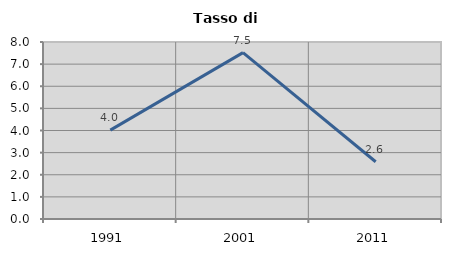
| Category | Tasso di disoccupazione   |
|---|---|
| 1991.0 | 4.016 |
| 2001.0 | 7.519 |
| 2011.0 | 2.586 |